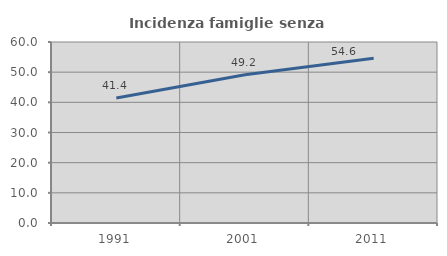
| Category | Incidenza famiglie senza nuclei |
|---|---|
| 1991.0 | 41.436 |
| 2001.0 | 49.171 |
| 2011.0 | 54.595 |